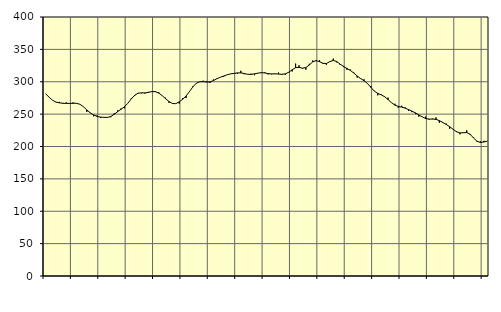
| Category | Piggar | Series 1 |
|---|---|---|
| nan | 281 | 281.24 |
| 87.0 | 276.2 | 276.09 |
| 87.0 | 271.5 | 271.44 |
| 87.0 | 268.3 | 268.53 |
| nan | 268.9 | 267.4 |
| 88.0 | 266.1 | 266.85 |
| 88.0 | 268 | 266.55 |
| 88.0 | 266.9 | 266.56 |
| nan | 268.2 | 266.75 |
| 89.0 | 267 | 266.68 |
| 89.0 | 265.2 | 265.19 |
| 89.0 | 261.7 | 261.53 |
| nan | 253.4 | 256.52 |
| 90.0 | 252.4 | 252.01 |
| 90.0 | 246.6 | 248.76 |
| 90.0 | 247.8 | 246.52 |
| nan | 244 | 245.4 |
| 91.0 | 245 | 244.96 |
| 91.0 | 245.4 | 244.95 |
| 91.0 | 245.2 | 246.22 |
| nan | 251.3 | 249.6 |
| 92.0 | 255.8 | 253.83 |
| 92.0 | 258.6 | 257.41 |
| 92.0 | 259 | 261.33 |
| nan | 266.8 | 266.8 |
| 93.0 | 274.4 | 273.44 |
| 93.0 | 277.9 | 279.18 |
| 93.0 | 282.8 | 282.31 |
| nan | 282.2 | 282.87 |
| 94.0 | 281.8 | 282.74 |
| 94.0 | 284.4 | 283.55 |
| 94.0 | 285.7 | 284.8 |
| nan | 285.6 | 284.74 |
| 95.0 | 284 | 282.5 |
| 95.0 | 278.6 | 278.71 |
| 95.0 | 275.4 | 273.93 |
| nan | 267.4 | 269.5 |
| 96.0 | 266.2 | 266.45 |
| 96.0 | 266.1 | 266.17 |
| 96.0 | 266.3 | 268.9 |
| nan | 274.6 | 272.88 |
| 97.0 | 274.8 | 278.07 |
| 97.0 | 285.1 | 284.81 |
| 97.0 | 293.1 | 292.22 |
| nan | 298.1 | 297.74 |
| 98.0 | 299.6 | 299.95 |
| 98.0 | 301.6 | 300.14 |
| 98.0 | 301.1 | 299.56 |
| nan | 298.2 | 299.75 |
| 99.0 | 303.5 | 301.79 |
| 99.0 | 305 | 304.64 |
| 99.0 | 306.9 | 306.92 |
| nan | 307.9 | 308.84 |
| 0.0 | 310.9 | 310.81 |
| 0.0 | 311.9 | 312.1 |
| 0.0 | 312.2 | 312.91 |
| nan | 312.2 | 313.65 |
| 1.0 | 316.9 | 313.73 |
| 1.0 | 311.6 | 312.74 |
| 1.0 | 311.3 | 311.52 |
| nan | 312.4 | 311.38 |
| 2.0 | 310.1 | 312.19 |
| 2.0 | 313.2 | 313.27 |
| 2.0 | 313.7 | 314.04 |
| nan | 314.6 | 313.65 |
| 3.0 | 311.3 | 312.55 |
| 3.0 | 311.5 | 312.12 |
| 3.0 | 312.5 | 312.21 |
| nan | 314.2 | 311.89 |
| 4.0 | 310.8 | 311.54 |
| 4.0 | 310.7 | 312.17 |
| 4.0 | 315.1 | 314.67 |
| nan | 315.9 | 318.57 |
| 5.0 | 328 | 321.79 |
| 5.0 | 325.4 | 322.26 |
| 5.0 | 320.3 | 320.95 |
| nan | 318.7 | 321.81 |
| 6.0 | 327.7 | 325.91 |
| 6.0 | 332.8 | 330.68 |
| 6.0 | 333.5 | 332.58 |
| nan | 333.2 | 331.03 |
| 7.0 | 327.6 | 328.45 |
| 7.0 | 326 | 328.25 |
| 7.0 | 330.8 | 331.04 |
| nan | 335.7 | 332.96 |
| 8.0 | 329.9 | 331.24 |
| 8.0 | 326.1 | 327.22 |
| 8.0 | 324.5 | 323.4 |
| nan | 318.5 | 320.57 |
| 9.0 | 318.9 | 317.49 |
| 9.0 | 314.2 | 313.43 |
| 9.0 | 306.4 | 308.9 |
| nan | 304.3 | 304.91 |
| 10.0 | 303.7 | 301.57 |
| 10.0 | 297.1 | 297.27 |
| 10.0 | 293.5 | 291.22 |
| nan | 285.9 | 285.56 |
| 11.0 | 279 | 282 |
| 11.0 | 280.6 | 279.8 |
| 11.0 | 277.5 | 276.9 |
| nan | 275.4 | 272.54 |
| 12.0 | 267.6 | 267.75 |
| 12.0 | 266 | 263.97 |
| 12.0 | 259.8 | 261.96 |
| nan | 262.9 | 260.85 |
| 13.0 | 260.4 | 259.22 |
| 13.0 | 255.1 | 256.99 |
| 13.0 | 253 | 254.64 |
| nan | 250.5 | 251.96 |
| 14.0 | 246.2 | 248.81 |
| 14.0 | 246 | 245.72 |
| 14.0 | 246.2 | 243.26 |
| nan | 241.5 | 242.27 |
| 15.0 | 243.1 | 242.36 |
| 15.0 | 244.9 | 241.93 |
| 15.0 | 236.6 | 239.98 |
| nan | 236.4 | 237.11 |
| 16.0 | 235.4 | 234.06 |
| 16.0 | 227.4 | 230.65 |
| 16.0 | 226.4 | 226.61 |
| nan | 223.9 | 222.79 |
| 17.0 | 218.8 | 220.95 |
| 17.0 | 221.7 | 221.24 |
| 17.0 | 225 | 221.64 |
| nan | 217.8 | 218.79 |
| 18.0 | 213.9 | 213.07 |
| 18.0 | 207.3 | 208.1 |
| 18.0 | 207.8 | 206.23 |
| nan | 208.8 | 206.91 |
| 19.0 | 208.4 | 208.25 |